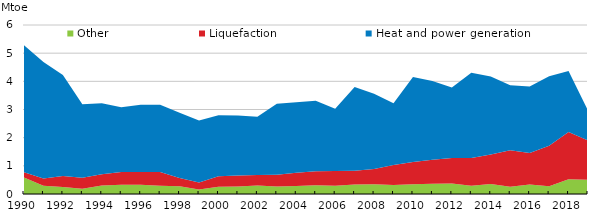
| Category | Other | Liquefaction | Heat and power generation |
|---|---|---|---|
| 1990.0 | 589.687 | 180.759 | 4513.216 |
| 1991.0 | 295.166 | 254.06 | 4141.598 |
| 1992.0 | 252.269 | 385.688 | 3587.771 |
| 1993.0 | 186.683 | 393.833 | 2603.313 |
| 1994.0 | 304.146 | 400.401 | 2516.131 |
| 1995.0 | 328.218 | 453.035 | 2299.326 |
| 1996.0 | 323.996 | 457.893 | 2385.721 |
| 1997.0 | 295.979 | 485.61 | 2384.891 |
| 1998.0 | 270.797 | 301.633 | 2311.663 |
| 1999.0 | 163.798 | 241.594 | 2203.91 |
| 2000.0 | 253.522 | 375.189 | 2168.88 |
| 2001.0 | 266.047 | 392.392 | 2130.45 |
| 2002.0 | 298.401 | 372.068 | 2072.662 |
| 2003.0 | 267.845 | 419.581 | 2520.291 |
| 2004.0 | 286.395 | 465.453 | 2507.709 |
| 2005.0 | 311.778 | 494.95 | 2506.64 |
| 2006.0 | 290.419 | 526.882 | 2205.536 |
| 2007.0 | 338.667 | 491.162 | 2969.577 |
| 2008.0 | 348.117 | 543.229 | 2670.231 |
| 2009.0 | 315.277 | 714.627 | 2193.411 |
| 2010.0 | 349.431 | 790.556 | 3011.513 |
| 2011.0 | 363.131 | 856.659 | 2790.162 |
| 2012.0 | 373.096 | 904.531 | 2500.168 |
| 2013.0 | 295.978 | 982.612 | 3024.375 |
| 2014.0 | 354.585 | 1044.091 | 2776.864 |
| 2015.0 | 261.507 | 1290.599 | 2304.601 |
| 2016.0 | 333.574 | 1121.144 | 2363.18 |
| 2017.0 | 273.597 | 1440.236 | 2466.867 |
| 2018.0 | 523.762 | 1673.021 | 2168.768 |
| 2019.0 | 508.494 | 1391.991 | 1066.438 |